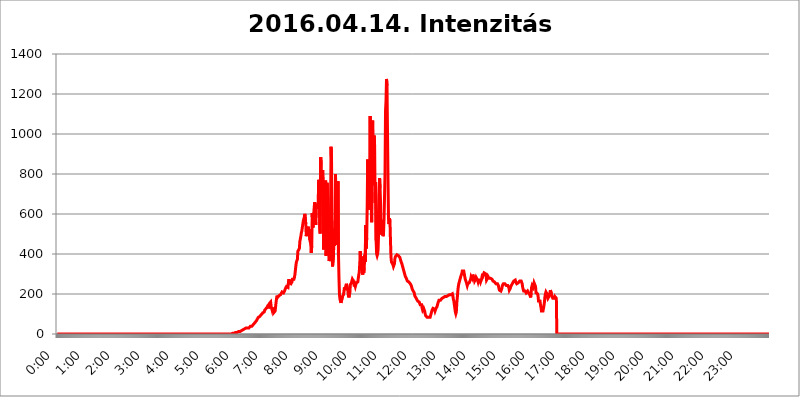
| Category | 2016.04.14. Intenzitás [W/m^2] |
|---|---|
| 0.0 | 0 |
| 0.0006944444444444445 | 0 |
| 0.001388888888888889 | 0 |
| 0.0020833333333333333 | 0 |
| 0.002777777777777778 | 0 |
| 0.003472222222222222 | 0 |
| 0.004166666666666667 | 0 |
| 0.004861111111111111 | 0 |
| 0.005555555555555556 | 0 |
| 0.0062499999999999995 | 0 |
| 0.006944444444444444 | 0 |
| 0.007638888888888889 | 0 |
| 0.008333333333333333 | 0 |
| 0.009027777777777779 | 0 |
| 0.009722222222222222 | 0 |
| 0.010416666666666666 | 0 |
| 0.011111111111111112 | 0 |
| 0.011805555555555555 | 0 |
| 0.012499999999999999 | 0 |
| 0.013194444444444444 | 0 |
| 0.013888888888888888 | 0 |
| 0.014583333333333332 | 0 |
| 0.015277777777777777 | 0 |
| 0.015972222222222224 | 0 |
| 0.016666666666666666 | 0 |
| 0.017361111111111112 | 0 |
| 0.018055555555555557 | 0 |
| 0.01875 | 0 |
| 0.019444444444444445 | 0 |
| 0.02013888888888889 | 0 |
| 0.020833333333333332 | 0 |
| 0.02152777777777778 | 0 |
| 0.022222222222222223 | 0 |
| 0.02291666666666667 | 0 |
| 0.02361111111111111 | 0 |
| 0.024305555555555556 | 0 |
| 0.024999999999999998 | 0 |
| 0.025694444444444447 | 0 |
| 0.02638888888888889 | 0 |
| 0.027083333333333334 | 0 |
| 0.027777777777777776 | 0 |
| 0.02847222222222222 | 0 |
| 0.029166666666666664 | 0 |
| 0.029861111111111113 | 0 |
| 0.030555555555555555 | 0 |
| 0.03125 | 0 |
| 0.03194444444444445 | 0 |
| 0.03263888888888889 | 0 |
| 0.03333333333333333 | 0 |
| 0.034027777777777775 | 0 |
| 0.034722222222222224 | 0 |
| 0.035416666666666666 | 0 |
| 0.036111111111111115 | 0 |
| 0.03680555555555556 | 0 |
| 0.0375 | 0 |
| 0.03819444444444444 | 0 |
| 0.03888888888888889 | 0 |
| 0.03958333333333333 | 0 |
| 0.04027777777777778 | 0 |
| 0.04097222222222222 | 0 |
| 0.041666666666666664 | 0 |
| 0.042361111111111106 | 0 |
| 0.04305555555555556 | 0 |
| 0.043750000000000004 | 0 |
| 0.044444444444444446 | 0 |
| 0.04513888888888889 | 0 |
| 0.04583333333333334 | 0 |
| 0.04652777777777778 | 0 |
| 0.04722222222222222 | 0 |
| 0.04791666666666666 | 0 |
| 0.04861111111111111 | 0 |
| 0.049305555555555554 | 0 |
| 0.049999999999999996 | 0 |
| 0.05069444444444445 | 0 |
| 0.051388888888888894 | 0 |
| 0.052083333333333336 | 0 |
| 0.05277777777777778 | 0 |
| 0.05347222222222222 | 0 |
| 0.05416666666666667 | 0 |
| 0.05486111111111111 | 0 |
| 0.05555555555555555 | 0 |
| 0.05625 | 0 |
| 0.05694444444444444 | 0 |
| 0.057638888888888885 | 0 |
| 0.05833333333333333 | 0 |
| 0.05902777777777778 | 0 |
| 0.059722222222222225 | 0 |
| 0.06041666666666667 | 0 |
| 0.061111111111111116 | 0 |
| 0.06180555555555556 | 0 |
| 0.0625 | 0 |
| 0.06319444444444444 | 0 |
| 0.06388888888888888 | 0 |
| 0.06458333333333334 | 0 |
| 0.06527777777777778 | 0 |
| 0.06597222222222222 | 0 |
| 0.06666666666666667 | 0 |
| 0.06736111111111111 | 0 |
| 0.06805555555555555 | 0 |
| 0.06874999999999999 | 0 |
| 0.06944444444444443 | 0 |
| 0.07013888888888889 | 0 |
| 0.07083333333333333 | 0 |
| 0.07152777777777779 | 0 |
| 0.07222222222222223 | 0 |
| 0.07291666666666667 | 0 |
| 0.07361111111111111 | 0 |
| 0.07430555555555556 | 0 |
| 0.075 | 0 |
| 0.07569444444444444 | 0 |
| 0.0763888888888889 | 0 |
| 0.07708333333333334 | 0 |
| 0.07777777777777778 | 0 |
| 0.07847222222222222 | 0 |
| 0.07916666666666666 | 0 |
| 0.0798611111111111 | 0 |
| 0.08055555555555556 | 0 |
| 0.08125 | 0 |
| 0.08194444444444444 | 0 |
| 0.08263888888888889 | 0 |
| 0.08333333333333333 | 0 |
| 0.08402777777777777 | 0 |
| 0.08472222222222221 | 0 |
| 0.08541666666666665 | 0 |
| 0.08611111111111112 | 0 |
| 0.08680555555555557 | 0 |
| 0.08750000000000001 | 0 |
| 0.08819444444444445 | 0 |
| 0.08888888888888889 | 0 |
| 0.08958333333333333 | 0 |
| 0.09027777777777778 | 0 |
| 0.09097222222222222 | 0 |
| 0.09166666666666667 | 0 |
| 0.09236111111111112 | 0 |
| 0.09305555555555556 | 0 |
| 0.09375 | 0 |
| 0.09444444444444444 | 0 |
| 0.09513888888888888 | 0 |
| 0.09583333333333333 | 0 |
| 0.09652777777777777 | 0 |
| 0.09722222222222222 | 0 |
| 0.09791666666666667 | 0 |
| 0.09861111111111111 | 0 |
| 0.09930555555555555 | 0 |
| 0.09999999999999999 | 0 |
| 0.10069444444444443 | 0 |
| 0.1013888888888889 | 0 |
| 0.10208333333333335 | 0 |
| 0.10277777777777779 | 0 |
| 0.10347222222222223 | 0 |
| 0.10416666666666667 | 0 |
| 0.10486111111111111 | 0 |
| 0.10555555555555556 | 0 |
| 0.10625 | 0 |
| 0.10694444444444444 | 0 |
| 0.1076388888888889 | 0 |
| 0.10833333333333334 | 0 |
| 0.10902777777777778 | 0 |
| 0.10972222222222222 | 0 |
| 0.1111111111111111 | 0 |
| 0.11180555555555556 | 0 |
| 0.11180555555555556 | 0 |
| 0.1125 | 0 |
| 0.11319444444444444 | 0 |
| 0.11388888888888889 | 0 |
| 0.11458333333333333 | 0 |
| 0.11527777777777777 | 0 |
| 0.11597222222222221 | 0 |
| 0.11666666666666665 | 0 |
| 0.1173611111111111 | 0 |
| 0.11805555555555557 | 0 |
| 0.11944444444444445 | 0 |
| 0.12013888888888889 | 0 |
| 0.12083333333333333 | 0 |
| 0.12152777777777778 | 0 |
| 0.12222222222222223 | 0 |
| 0.12291666666666667 | 0 |
| 0.12291666666666667 | 0 |
| 0.12361111111111112 | 0 |
| 0.12430555555555556 | 0 |
| 0.125 | 0 |
| 0.12569444444444444 | 0 |
| 0.12638888888888888 | 0 |
| 0.12708333333333333 | 0 |
| 0.16875 | 0 |
| 0.12847222222222224 | 0 |
| 0.12916666666666668 | 0 |
| 0.12986111111111112 | 0 |
| 0.13055555555555556 | 0 |
| 0.13125 | 0 |
| 0.13194444444444445 | 0 |
| 0.1326388888888889 | 0 |
| 0.13333333333333333 | 0 |
| 0.13402777777777777 | 0 |
| 0.13402777777777777 | 0 |
| 0.13472222222222222 | 0 |
| 0.13541666666666666 | 0 |
| 0.1361111111111111 | 0 |
| 0.13749999999999998 | 0 |
| 0.13819444444444443 | 0 |
| 0.1388888888888889 | 0 |
| 0.13958333333333334 | 0 |
| 0.14027777777777778 | 0 |
| 0.14097222222222222 | 0 |
| 0.14166666666666666 | 0 |
| 0.1423611111111111 | 0 |
| 0.14305555555555557 | 0 |
| 0.14375000000000002 | 0 |
| 0.14444444444444446 | 0 |
| 0.1451388888888889 | 0 |
| 0.1451388888888889 | 0 |
| 0.14652777777777778 | 0 |
| 0.14722222222222223 | 0 |
| 0.14791666666666667 | 0 |
| 0.1486111111111111 | 0 |
| 0.14930555555555555 | 0 |
| 0.15 | 0 |
| 0.15069444444444444 | 0 |
| 0.15138888888888888 | 0 |
| 0.15208333333333332 | 0 |
| 0.15277777777777776 | 0 |
| 0.15347222222222223 | 0 |
| 0.15416666666666667 | 0 |
| 0.15486111111111112 | 0 |
| 0.15555555555555556 | 0 |
| 0.15625 | 0 |
| 0.15694444444444444 | 0 |
| 0.15763888888888888 | 0 |
| 0.15833333333333333 | 0 |
| 0.15902777777777777 | 0 |
| 0.15972222222222224 | 0 |
| 0.16041666666666668 | 0 |
| 0.16111111111111112 | 0 |
| 0.16180555555555556 | 0 |
| 0.1625 | 0 |
| 0.16319444444444445 | 0 |
| 0.1638888888888889 | 0 |
| 0.16458333333333333 | 0 |
| 0.16527777777777777 | 0 |
| 0.16597222222222222 | 0 |
| 0.16666666666666666 | 0 |
| 0.1673611111111111 | 0 |
| 0.16805555555555554 | 0 |
| 0.16874999999999998 | 0 |
| 0.16944444444444443 | 0 |
| 0.17013888888888887 | 0 |
| 0.1708333333333333 | 0 |
| 0.17152777777777775 | 0 |
| 0.17222222222222225 | 0 |
| 0.1729166666666667 | 0 |
| 0.17361111111111113 | 0 |
| 0.17430555555555557 | 0 |
| 0.17500000000000002 | 0 |
| 0.17569444444444446 | 0 |
| 0.1763888888888889 | 0 |
| 0.17708333333333334 | 0 |
| 0.17777777777777778 | 0 |
| 0.17847222222222223 | 0 |
| 0.17916666666666667 | 0 |
| 0.1798611111111111 | 0 |
| 0.18055555555555555 | 0 |
| 0.18125 | 0 |
| 0.18194444444444444 | 0 |
| 0.1826388888888889 | 0 |
| 0.18333333333333335 | 0 |
| 0.1840277777777778 | 0 |
| 0.18472222222222223 | 0 |
| 0.18541666666666667 | 0 |
| 0.18611111111111112 | 0 |
| 0.18680555555555556 | 0 |
| 0.1875 | 0 |
| 0.18819444444444444 | 0 |
| 0.18888888888888888 | 0 |
| 0.18958333333333333 | 0 |
| 0.19027777777777777 | 0 |
| 0.1909722222222222 | 0 |
| 0.19166666666666665 | 0 |
| 0.19236111111111112 | 0 |
| 0.19305555555555554 | 0 |
| 0.19375 | 0 |
| 0.19444444444444445 | 0 |
| 0.1951388888888889 | 0 |
| 0.19583333333333333 | 0 |
| 0.19652777777777777 | 0 |
| 0.19722222222222222 | 0 |
| 0.19791666666666666 | 0 |
| 0.1986111111111111 | 0 |
| 0.19930555555555554 | 0 |
| 0.19999999999999998 | 0 |
| 0.20069444444444443 | 0 |
| 0.20138888888888887 | 0 |
| 0.2020833333333333 | 0 |
| 0.2027777777777778 | 0 |
| 0.2034722222222222 | 0 |
| 0.2041666666666667 | 0 |
| 0.20486111111111113 | 0 |
| 0.20555555555555557 | 0 |
| 0.20625000000000002 | 0 |
| 0.20694444444444446 | 0 |
| 0.2076388888888889 | 0 |
| 0.20833333333333334 | 0 |
| 0.20902777777777778 | 0 |
| 0.20972222222222223 | 0 |
| 0.21041666666666667 | 0 |
| 0.2111111111111111 | 0 |
| 0.21180555555555555 | 0 |
| 0.2125 | 0 |
| 0.21319444444444444 | 0 |
| 0.2138888888888889 | 0 |
| 0.21458333333333335 | 0 |
| 0.2152777777777778 | 0 |
| 0.21597222222222223 | 0 |
| 0.21666666666666667 | 0 |
| 0.21736111111111112 | 0 |
| 0.21805555555555556 | 0 |
| 0.21875 | 0 |
| 0.21944444444444444 | 0 |
| 0.22013888888888888 | 0 |
| 0.22083333333333333 | 0 |
| 0.22152777777777777 | 0 |
| 0.2222222222222222 | 0 |
| 0.22291666666666665 | 0 |
| 0.2236111111111111 | 0 |
| 0.22430555555555556 | 0 |
| 0.225 | 0 |
| 0.22569444444444445 | 0 |
| 0.2263888888888889 | 0 |
| 0.22708333333333333 | 0 |
| 0.22777777777777777 | 0 |
| 0.22847222222222222 | 0 |
| 0.22916666666666666 | 0 |
| 0.2298611111111111 | 0 |
| 0.23055555555555554 | 0 |
| 0.23124999999999998 | 0 |
| 0.23194444444444443 | 0 |
| 0.23263888888888887 | 0 |
| 0.2333333333333333 | 0 |
| 0.2340277777777778 | 0 |
| 0.2347222222222222 | 0 |
| 0.2354166666666667 | 0 |
| 0.23611111111111113 | 0 |
| 0.23680555555555557 | 0 |
| 0.23750000000000002 | 0 |
| 0.23819444444444446 | 0 |
| 0.2388888888888889 | 0 |
| 0.23958333333333334 | 0 |
| 0.24027777777777778 | 0 |
| 0.24097222222222223 | 0 |
| 0.24166666666666667 | 0 |
| 0.2423611111111111 | 0 |
| 0.24305555555555555 | 0 |
| 0.24375 | 0 |
| 0.24444444444444446 | 0 |
| 0.24513888888888888 | 0 |
| 0.24583333333333335 | 3.525 |
| 0.2465277777777778 | 3.525 |
| 0.24722222222222223 | 3.525 |
| 0.24791666666666667 | 3.525 |
| 0.24861111111111112 | 3.525 |
| 0.24930555555555556 | 3.525 |
| 0.25 | 7.887 |
| 0.25069444444444444 | 7.887 |
| 0.2513888888888889 | 7.887 |
| 0.2520833333333333 | 7.887 |
| 0.25277777777777777 | 12.257 |
| 0.2534722222222222 | 12.257 |
| 0.25416666666666665 | 12.257 |
| 0.2548611111111111 | 12.257 |
| 0.2555555555555556 | 12.257 |
| 0.25625000000000003 | 12.257 |
| 0.2569444444444445 | 16.636 |
| 0.2576388888888889 | 16.636 |
| 0.25833333333333336 | 16.636 |
| 0.2590277777777778 | 16.636 |
| 0.25972222222222224 | 21.024 |
| 0.2604166666666667 | 21.024 |
| 0.2611111111111111 | 21.024 |
| 0.26180555555555557 | 25.419 |
| 0.2625 | 25.419 |
| 0.26319444444444445 | 29.823 |
| 0.2638888888888889 | 29.823 |
| 0.26458333333333334 | 29.823 |
| 0.2652777777777778 | 29.823 |
| 0.2659722222222222 | 29.823 |
| 0.26666666666666666 | 29.823 |
| 0.2673611111111111 | 29.823 |
| 0.26805555555555555 | 29.823 |
| 0.26875 | 29.823 |
| 0.26944444444444443 | 34.234 |
| 0.2701388888888889 | 34.234 |
| 0.2708333333333333 | 38.653 |
| 0.27152777777777776 | 38.653 |
| 0.2722222222222222 | 38.653 |
| 0.27291666666666664 | 38.653 |
| 0.2736111111111111 | 43.079 |
| 0.2743055555555555 | 43.079 |
| 0.27499999999999997 | 47.511 |
| 0.27569444444444446 | 47.511 |
| 0.27638888888888885 | 51.951 |
| 0.27708333333333335 | 56.398 |
| 0.2777777777777778 | 60.85 |
| 0.27847222222222223 | 60.85 |
| 0.2791666666666667 | 65.31 |
| 0.2798611111111111 | 65.31 |
| 0.28055555555555556 | 74.246 |
| 0.28125 | 74.246 |
| 0.28194444444444444 | 83.205 |
| 0.2826388888888889 | 83.205 |
| 0.2833333333333333 | 83.205 |
| 0.28402777777777777 | 87.692 |
| 0.2847222222222222 | 87.692 |
| 0.28541666666666665 | 92.184 |
| 0.28611111111111115 | 96.682 |
| 0.28680555555555554 | 96.682 |
| 0.28750000000000003 | 101.184 |
| 0.2881944444444445 | 105.69 |
| 0.2888888888888889 | 105.69 |
| 0.28958333333333336 | 110.201 |
| 0.2902777777777778 | 110.201 |
| 0.29097222222222224 | 119.235 |
| 0.2916666666666667 | 119.235 |
| 0.2923611111111111 | 119.235 |
| 0.29305555555555557 | 128.284 |
| 0.29375 | 132.814 |
| 0.29444444444444445 | 123.758 |
| 0.2951388888888889 | 137.347 |
| 0.29583333333333334 | 146.423 |
| 0.2965277777777778 | 128.284 |
| 0.2972222222222222 | 150.964 |
| 0.29791666666666666 | 155.509 |
| 0.2986111111111111 | 155.509 |
| 0.29930555555555555 | 160.056 |
| 0.3 | 137.347 |
| 0.30069444444444443 | 132.814 |
| 0.3013888888888889 | 119.235 |
| 0.3020833333333333 | 114.716 |
| 0.30277777777777776 | 132.814 |
| 0.3034722222222222 | 105.69 |
| 0.30416666666666664 | 110.201 |
| 0.3048611111111111 | 110.201 |
| 0.3055555555555555 | 114.716 |
| 0.30624999999999997 | 119.235 |
| 0.3069444444444444 | 160.056 |
| 0.3076388888888889 | 178.264 |
| 0.30833333333333335 | 191.937 |
| 0.3090277777777778 | 182.82 |
| 0.30972222222222223 | 187.378 |
| 0.3104166666666667 | 187.378 |
| 0.3111111111111111 | 191.937 |
| 0.31180555555555556 | 196.497 |
| 0.3125 | 191.937 |
| 0.31319444444444444 | 196.497 |
| 0.3138888888888889 | 196.497 |
| 0.3145833333333333 | 201.058 |
| 0.31527777777777777 | 210.182 |
| 0.3159722222222222 | 205.62 |
| 0.31666666666666665 | 205.62 |
| 0.31736111111111115 | 205.62 |
| 0.31805555555555554 | 210.182 |
| 0.31875000000000003 | 214.746 |
| 0.3194444444444445 | 219.309 |
| 0.3201388888888889 | 228.436 |
| 0.32083333333333336 | 228.436 |
| 0.3215277777777778 | 237.564 |
| 0.32222222222222224 | 233 |
| 0.3229166666666667 | 237.564 |
| 0.3236111111111111 | 233 |
| 0.32430555555555557 | 260.373 |
| 0.325 | 274.047 |
| 0.32569444444444445 | 255.813 |
| 0.3263888888888889 | 260.373 |
| 0.32708333333333334 | 251.251 |
| 0.3277777777777778 | 251.251 |
| 0.3284722222222222 | 255.813 |
| 0.32916666666666666 | 260.373 |
| 0.3298611111111111 | 274.047 |
| 0.33055555555555555 | 269.49 |
| 0.33125 | 269.49 |
| 0.33194444444444443 | 274.047 |
| 0.3326388888888889 | 283.156 |
| 0.3333333333333333 | 296.808 |
| 0.3340277777777778 | 319.517 |
| 0.3347222222222222 | 342.162 |
| 0.3354166666666667 | 360.221 |
| 0.3361111111111111 | 360.221 |
| 0.3368055555555556 | 373.729 |
| 0.33749999999999997 | 414.035 |
| 0.33819444444444446 | 409.574 |
| 0.33888888888888885 | 414.035 |
| 0.33958333333333335 | 427.39 |
| 0.34027777777777773 | 462.786 |
| 0.34097222222222223 | 475.972 |
| 0.3416666666666666 | 489.108 |
| 0.3423611111111111 | 506.542 |
| 0.3430555555555555 | 515.223 |
| 0.34375 | 532.513 |
| 0.3444444444444445 | 549.704 |
| 0.3451388888888889 | 566.793 |
| 0.3458333333333334 | 575.299 |
| 0.34652777777777777 | 583.779 |
| 0.34722222222222227 | 600.661 |
| 0.34791666666666665 | 596.45 |
| 0.34861111111111115 | 549.704 |
| 0.34930555555555554 | 489.108 |
| 0.35000000000000003 | 515.223 |
| 0.3506944444444444 | 519.555 |
| 0.3513888888888889 | 515.223 |
| 0.3520833333333333 | 536.82 |
| 0.3527777777777778 | 493.475 |
| 0.3534722222222222 | 523.88 |
| 0.3541666666666667 | 471.582 |
| 0.3548611111111111 | 475.972 |
| 0.35555555555555557 | 449.551 |
| 0.35625 | 405.108 |
| 0.35694444444444445 | 440.702 |
| 0.3576388888888889 | 604.864 |
| 0.35833333333333334 | 532.513 |
| 0.3590277777777778 | 541.121 |
| 0.3597222222222222 | 600.661 |
| 0.36041666666666666 | 634.105 |
| 0.3611111111111111 | 658.909 |
| 0.36180555555555555 | 638.256 |
| 0.3625 | 545.416 |
| 0.36319444444444443 | 650.667 |
| 0.3638888888888889 | 642.4 |
| 0.3645833333333333 | 625.784 |
| 0.3652777777777778 | 625.784 |
| 0.3659722222222222 | 650.667 |
| 0.3666666666666667 | 771.559 |
| 0.3673611111111111 | 755.766 |
| 0.3680555555555556 | 532.513 |
| 0.36874999999999997 | 502.192 |
| 0.36944444444444446 | 883.516 |
| 0.37013888888888885 | 849.199 |
| 0.37083333333333335 | 759.723 |
| 0.37152777777777773 | 747.834 |
| 0.37222222222222223 | 818.392 |
| 0.3729166666666666 | 747.834 |
| 0.3736111111111111 | 422.943 |
| 0.3743055555555555 | 699.717 |
| 0.375 | 523.88 |
| 0.3756944444444445 | 541.121 |
| 0.3763888888888889 | 767.62 |
| 0.3770833333333334 | 391.685 |
| 0.37777777777777777 | 431.833 |
| 0.37847222222222227 | 755.766 |
| 0.37916666666666665 | 699.717 |
| 0.37986111111111115 | 650.667 |
| 0.38055555555555554 | 431.833 |
| 0.38125000000000003 | 364.728 |
| 0.3819444444444444 | 373.729 |
| 0.3826388888888889 | 497.836 |
| 0.3833333333333333 | 634.105 |
| 0.3840277777777778 | 936.33 |
| 0.3847222222222222 | 860.676 |
| 0.3854166666666667 | 462.786 |
| 0.3861111111111111 | 337.639 |
| 0.38680555555555557 | 333.113 |
| 0.3875 | 396.164 |
| 0.38819444444444445 | 523.88 |
| 0.3888888888888889 | 440.702 |
| 0.38958333333333334 | 566.793 |
| 0.3902777777777778 | 798.974 |
| 0.3909722222222222 | 449.551 |
| 0.39166666666666666 | 471.582 |
| 0.3923611111111111 | 445.129 |
| 0.39305555555555555 | 458.38 |
| 0.39375 | 763.674 |
| 0.39444444444444443 | 396.164 |
| 0.3951388888888889 | 278.603 |
| 0.3958333333333333 | 196.497 |
| 0.3965277777777778 | 173.709 |
| 0.3972222222222222 | 173.709 |
| 0.3979166666666667 | 155.509 |
| 0.3986111111111111 | 155.509 |
| 0.3993055555555556 | 155.509 |
| 0.39999999999999997 | 187.378 |
| 0.40069444444444446 | 187.378 |
| 0.40138888888888885 | 196.497 |
| 0.40208333333333335 | 210.182 |
| 0.40277777777777773 | 233 |
| 0.40347222222222223 | 219.309 |
| 0.4041666666666666 | 233 |
| 0.4048611111111111 | 242.127 |
| 0.4055555555555555 | 251.251 |
| 0.40625 | 251.251 |
| 0.4069444444444445 | 228.436 |
| 0.4076388888888889 | 214.746 |
| 0.4083333333333334 | 191.937 |
| 0.40902777777777777 | 182.82 |
| 0.40972222222222227 | 187.378 |
| 0.41041666666666665 | 210.182 |
| 0.41111111111111115 | 246.689 |
| 0.41180555555555554 | 242.127 |
| 0.41250000000000003 | 255.813 |
| 0.4131944444444444 | 251.251 |
| 0.4138888888888889 | 274.047 |
| 0.4145833333333333 | 269.49 |
| 0.4152777777777778 | 264.932 |
| 0.4159722222222222 | 251.251 |
| 0.4166666666666667 | 237.564 |
| 0.4173611111111111 | 246.689 |
| 0.41805555555555557 | 237.564 |
| 0.41875 | 237.564 |
| 0.41944444444444445 | 255.813 |
| 0.4201388888888889 | 260.373 |
| 0.42083333333333334 | 260.373 |
| 0.4215277777777778 | 260.373 |
| 0.4222222222222222 | 255.813 |
| 0.42291666666666666 | 296.808 |
| 0.4236111111111111 | 310.44 |
| 0.42430555555555555 | 351.198 |
| 0.425 | 414.035 |
| 0.42569444444444443 | 333.113 |
| 0.4263888888888889 | 342.162 |
| 0.4270833333333333 | 387.202 |
| 0.4277777777777778 | 305.898 |
| 0.4284722222222222 | 296.808 |
| 0.4291666666666667 | 319.517 |
| 0.4298611111111111 | 305.898 |
| 0.4305555555555556 | 328.584 |
| 0.43124999999999997 | 396.164 |
| 0.43194444444444446 | 360.221 |
| 0.43263888888888885 | 545.416 |
| 0.43333333333333335 | 427.39 |
| 0.43402777777777773 | 480.356 |
| 0.43472222222222223 | 642.4 |
| 0.4354166666666666 | 872.114 |
| 0.4361111111111111 | 621.613 |
| 0.4368055555555555 | 687.544 |
| 0.4375 | 723.889 |
| 0.4381944444444445 | 787.258 |
| 0.4388888888888889 | 1089.873 |
| 0.4395833333333334 | 723.889 |
| 0.44027777777777777 | 703.762 |
| 0.44097222222222227 | 558.261 |
| 0.44166666666666665 | 1022.323 |
| 0.44236111111111115 | 1067.267 |
| 0.44305555555555554 | 743.859 |
| 0.44375000000000003 | 917.534 |
| 0.4444444444444444 | 992.448 |
| 0.4451388888888889 | 940.082 |
| 0.4458333333333333 | 654.791 |
| 0.4465277777777778 | 759.723 |
| 0.4472222222222222 | 467.187 |
| 0.4479166666666667 | 400.638 |
| 0.4486111111111111 | 391.685 |
| 0.44930555555555557 | 400.638 |
| 0.45 | 422.943 |
| 0.45069444444444445 | 502.192 |
| 0.4513888888888889 | 691.608 |
| 0.45208333333333334 | 779.42 |
| 0.4527777777777778 | 727.896 |
| 0.4534722222222222 | 654.791 |
| 0.45416666666666666 | 497.836 |
| 0.4548611111111111 | 549.704 |
| 0.45555555555555555 | 571.049 |
| 0.45625 | 545.416 |
| 0.45694444444444443 | 489.108 |
| 0.4576388888888889 | 506.542 |
| 0.4583333333333333 | 575.299 |
| 0.4590277777777778 | 687.544 |
| 0.4597222222222222 | 802.868 |
| 0.4604166666666667 | 1116.426 |
| 0.4611111111111111 | 1166.46 |
| 0.4618055555555556 | 1275.142 |
| 0.46249999999999997 | 1242.089 |
| 0.46319444444444446 | 1242.089 |
| 0.46388888888888885 | 775.492 |
| 0.46458333333333335 | 579.542 |
| 0.46527777777777773 | 549.704 |
| 0.46597222222222223 | 579.542 |
| 0.4666666666666666 | 562.53 |
| 0.4673611111111111 | 467.187 |
| 0.4680555555555555 | 387.202 |
| 0.46875 | 360.221 |
| 0.4694444444444445 | 360.221 |
| 0.4701388888888889 | 355.712 |
| 0.4708333333333334 | 346.682 |
| 0.47152777777777777 | 337.639 |
| 0.47222222222222227 | 337.639 |
| 0.47291666666666665 | 351.198 |
| 0.47361111111111115 | 378.224 |
| 0.47430555555555554 | 387.202 |
| 0.47500000000000003 | 391.685 |
| 0.4756944444444444 | 391.685 |
| 0.4763888888888889 | 396.164 |
| 0.4770833333333333 | 396.164 |
| 0.4777777777777778 | 396.164 |
| 0.4784722222222222 | 391.685 |
| 0.4791666666666667 | 387.202 |
| 0.4798611111111111 | 387.202 |
| 0.48055555555555557 | 382.715 |
| 0.48125 | 373.729 |
| 0.48194444444444445 | 364.728 |
| 0.4826388888888889 | 360.221 |
| 0.48333333333333334 | 351.198 |
| 0.4840277777777778 | 342.162 |
| 0.4847222222222222 | 333.113 |
| 0.48541666666666666 | 324.052 |
| 0.4861111111111111 | 314.98 |
| 0.48680555555555555 | 310.44 |
| 0.4875 | 296.808 |
| 0.48819444444444443 | 287.709 |
| 0.4888888888888889 | 287.709 |
| 0.4895833333333333 | 278.603 |
| 0.4902777777777778 | 274.047 |
| 0.4909722222222222 | 264.932 |
| 0.4916666666666667 | 260.373 |
| 0.4923611111111111 | 260.373 |
| 0.4930555555555556 | 260.373 |
| 0.49374999999999997 | 260.373 |
| 0.49444444444444446 | 255.813 |
| 0.49513888888888885 | 251.251 |
| 0.49583333333333335 | 251.251 |
| 0.49652777777777773 | 242.127 |
| 0.49722222222222223 | 233 |
| 0.4979166666666666 | 223.873 |
| 0.4986111111111111 | 219.309 |
| 0.4993055555555555 | 214.746 |
| 0.5 | 210.182 |
| 0.5006944444444444 | 205.62 |
| 0.5013888888888889 | 191.937 |
| 0.5020833333333333 | 187.378 |
| 0.5027777777777778 | 182.82 |
| 0.5034722222222222 | 178.264 |
| 0.5041666666666667 | 173.709 |
| 0.5048611111111111 | 169.156 |
| 0.5055555555555555 | 164.605 |
| 0.50625 | 164.605 |
| 0.5069444444444444 | 164.605 |
| 0.5076388888888889 | 160.056 |
| 0.5083333333333333 | 155.509 |
| 0.5090277777777777 | 146.423 |
| 0.5097222222222222 | 141.884 |
| 0.5104166666666666 | 141.884 |
| 0.5111111111111112 | 146.423 |
| 0.5118055555555555 | 128.284 |
| 0.5125000000000001 | 119.235 |
| 0.5131944444444444 | 119.235 |
| 0.513888888888889 | 128.284 |
| 0.5145833333333333 | 123.758 |
| 0.5152777777777778 | 114.716 |
| 0.5159722222222222 | 101.184 |
| 0.5166666666666667 | 92.184 |
| 0.517361111111111 | 87.692 |
| 0.5180555555555556 | 87.692 |
| 0.5187499999999999 | 83.205 |
| 0.5194444444444445 | 83.205 |
| 0.5201388888888888 | 83.205 |
| 0.5208333333333334 | 83.205 |
| 0.5215277777777778 | 83.205 |
| 0.5222222222222223 | 83.205 |
| 0.5229166666666667 | 83.205 |
| 0.5236111111111111 | 87.692 |
| 0.5243055555555556 | 101.184 |
| 0.525 | 110.201 |
| 0.5256944444444445 | 119.235 |
| 0.5263888888888889 | 119.235 |
| 0.5270833333333333 | 128.284 |
| 0.5277777777777778 | 128.284 |
| 0.5284722222222222 | 128.284 |
| 0.5291666666666667 | 123.758 |
| 0.5298611111111111 | 114.716 |
| 0.5305555555555556 | 119.235 |
| 0.53125 | 128.284 |
| 0.5319444444444444 | 132.814 |
| 0.5326388888888889 | 137.347 |
| 0.5333333333333333 | 146.423 |
| 0.5340277777777778 | 155.509 |
| 0.5347222222222222 | 160.056 |
| 0.5354166666666667 | 169.156 |
| 0.5361111111111111 | 173.709 |
| 0.5368055555555555 | 173.709 |
| 0.5375 | 169.156 |
| 0.5381944444444444 | 164.605 |
| 0.5388888888888889 | 169.156 |
| 0.5395833333333333 | 178.264 |
| 0.5402777777777777 | 182.82 |
| 0.5409722222222222 | 182.82 |
| 0.5416666666666666 | 182.82 |
| 0.5423611111111112 | 182.82 |
| 0.5430555555555555 | 187.378 |
| 0.5437500000000001 | 187.378 |
| 0.5444444444444444 | 187.378 |
| 0.545138888888889 | 187.378 |
| 0.5458333333333333 | 187.378 |
| 0.5465277777777778 | 187.378 |
| 0.5472222222222222 | 187.378 |
| 0.5479166666666667 | 191.937 |
| 0.548611111111111 | 191.937 |
| 0.5493055555555556 | 191.937 |
| 0.5499999999999999 | 196.497 |
| 0.5506944444444445 | 191.937 |
| 0.5513888888888888 | 191.937 |
| 0.5520833333333334 | 196.497 |
| 0.5527777777777778 | 196.497 |
| 0.5534722222222223 | 196.497 |
| 0.5541666666666667 | 201.058 |
| 0.5548611111111111 | 191.937 |
| 0.5555555555555556 | 173.709 |
| 0.55625 | 164.605 |
| 0.5569444444444445 | 146.423 |
| 0.5576388888888889 | 128.284 |
| 0.5583333333333333 | 110.201 |
| 0.5590277777777778 | 101.184 |
| 0.5597222222222222 | 110.201 |
| 0.5604166666666667 | 155.509 |
| 0.5611111111111111 | 182.82 |
| 0.5618055555555556 | 214.746 |
| 0.5625 | 237.564 |
| 0.5631944444444444 | 251.251 |
| 0.5638888888888889 | 260.373 |
| 0.5645833333333333 | 269.49 |
| 0.5652777777777778 | 278.603 |
| 0.5659722222222222 | 287.709 |
| 0.5666666666666667 | 292.259 |
| 0.5673611111111111 | 301.354 |
| 0.5680555555555555 | 314.98 |
| 0.56875 | 319.517 |
| 0.5694444444444444 | 319.517 |
| 0.5701388888888889 | 314.98 |
| 0.5708333333333333 | 301.354 |
| 0.5715277777777777 | 287.709 |
| 0.5722222222222222 | 274.047 |
| 0.5729166666666666 | 269.49 |
| 0.5736111111111112 | 260.373 |
| 0.5743055555555555 | 255.813 |
| 0.5750000000000001 | 242.127 |
| 0.5756944444444444 | 251.251 |
| 0.576388888888889 | 251.251 |
| 0.5770833333333333 | 255.813 |
| 0.5777777777777778 | 255.813 |
| 0.5784722222222222 | 251.251 |
| 0.5791666666666667 | 260.373 |
| 0.579861111111111 | 274.047 |
| 0.5805555555555556 | 287.709 |
| 0.5812499999999999 | 287.709 |
| 0.5819444444444445 | 278.603 |
| 0.5826388888888888 | 296.808 |
| 0.5833333333333334 | 301.354 |
| 0.5840277777777778 | 292.259 |
| 0.5847222222222223 | 278.603 |
| 0.5854166666666667 | 264.932 |
| 0.5861111111111111 | 260.373 |
| 0.5868055555555556 | 274.047 |
| 0.5875 | 283.156 |
| 0.5881944444444445 | 278.603 |
| 0.5888888888888889 | 278.603 |
| 0.5895833333333333 | 269.49 |
| 0.5902777777777778 | 260.373 |
| 0.5909722222222222 | 269.49 |
| 0.5916666666666667 | 269.49 |
| 0.5923611111111111 | 264.932 |
| 0.5930555555555556 | 269.49 |
| 0.59375 | 260.373 |
| 0.5944444444444444 | 255.813 |
| 0.5951388888888889 | 274.047 |
| 0.5958333333333333 | 287.709 |
| 0.5965277777777778 | 301.354 |
| 0.5972222222222222 | 292.259 |
| 0.5979166666666667 | 296.808 |
| 0.5986111111111111 | 305.898 |
| 0.5993055555555555 | 305.898 |
| 0.6 | 305.898 |
| 0.6006944444444444 | 301.354 |
| 0.6013888888888889 | 292.259 |
| 0.6020833333333333 | 269.49 |
| 0.6027777777777777 | 264.932 |
| 0.6034722222222222 | 278.603 |
| 0.6041666666666666 | 287.709 |
| 0.6048611111111112 | 283.156 |
| 0.6055555555555555 | 278.603 |
| 0.6062500000000001 | 278.603 |
| 0.6069444444444444 | 278.603 |
| 0.607638888888889 | 278.603 |
| 0.6083333333333333 | 278.603 |
| 0.6090277777777778 | 278.603 |
| 0.6097222222222222 | 274.047 |
| 0.6104166666666667 | 269.49 |
| 0.611111111111111 | 264.932 |
| 0.6118055555555556 | 260.373 |
| 0.6124999999999999 | 260.373 |
| 0.6131944444444445 | 260.373 |
| 0.6138888888888888 | 260.373 |
| 0.6145833333333334 | 255.813 |
| 0.6152777777777778 | 251.251 |
| 0.6159722222222223 | 255.813 |
| 0.6166666666666667 | 251.251 |
| 0.6173611111111111 | 251.251 |
| 0.6180555555555556 | 246.689 |
| 0.61875 | 242.127 |
| 0.6194444444444445 | 228.436 |
| 0.6201388888888889 | 219.309 |
| 0.6208333333333333 | 219.309 |
| 0.6215277777777778 | 219.309 |
| 0.6222222222222222 | 214.746 |
| 0.6229166666666667 | 219.309 |
| 0.6236111111111111 | 228.436 |
| 0.6243055555555556 | 242.127 |
| 0.625 | 246.689 |
| 0.6256944444444444 | 251.251 |
| 0.6263888888888889 | 251.251 |
| 0.6270833333333333 | 251.251 |
| 0.6277777777777778 | 251.251 |
| 0.6284722222222222 | 251.251 |
| 0.6291666666666667 | 251.251 |
| 0.6298611111111111 | 242.127 |
| 0.6305555555555555 | 242.127 |
| 0.63125 | 242.127 |
| 0.6319444444444444 | 242.127 |
| 0.6326388888888889 | 242.127 |
| 0.6333333333333333 | 233 |
| 0.6340277777777777 | 219.309 |
| 0.6347222222222222 | 223.873 |
| 0.6354166666666666 | 228.436 |
| 0.6361111111111112 | 237.564 |
| 0.6368055555555555 | 242.127 |
| 0.6375000000000001 | 246.689 |
| 0.6381944444444444 | 251.251 |
| 0.638888888888889 | 255.813 |
| 0.6395833333333333 | 260.373 |
| 0.6402777777777778 | 264.932 |
| 0.6409722222222222 | 269.49 |
| 0.6416666666666667 | 269.49 |
| 0.642361111111111 | 269.49 |
| 0.6430555555555556 | 260.373 |
| 0.6437499999999999 | 255.813 |
| 0.6444444444444445 | 251.251 |
| 0.6451388888888888 | 251.251 |
| 0.6458333333333334 | 251.251 |
| 0.6465277777777778 | 255.813 |
| 0.6472222222222223 | 255.813 |
| 0.6479166666666667 | 260.373 |
| 0.6486111111111111 | 264.932 |
| 0.6493055555555556 | 269.49 |
| 0.65 | 269.49 |
| 0.6506944444444445 | 264.932 |
| 0.6513888888888889 | 260.373 |
| 0.6520833333333333 | 251.251 |
| 0.6527777777777778 | 233 |
| 0.6534722222222222 | 223.873 |
| 0.6541666666666667 | 214.746 |
| 0.6548611111111111 | 214.746 |
| 0.6555555555555556 | 214.746 |
| 0.65625 | 214.746 |
| 0.6569444444444444 | 210.182 |
| 0.6576388888888889 | 205.62 |
| 0.6583333333333333 | 205.62 |
| 0.6590277777777778 | 201.058 |
| 0.6597222222222222 | 214.746 |
| 0.6604166666666667 | 214.746 |
| 0.6611111111111111 | 219.309 |
| 0.6618055555555555 | 201.058 |
| 0.6625 | 196.497 |
| 0.6631944444444444 | 191.937 |
| 0.6638888888888889 | 182.82 |
| 0.6645833333333333 | 205.62 |
| 0.6652777777777777 | 233 |
| 0.6659722222222222 | 242.127 |
| 0.6666666666666666 | 242.127 |
| 0.6673611111111111 | 233 |
| 0.6680555555555556 | 242.127 |
| 0.6687500000000001 | 255.813 |
| 0.6694444444444444 | 260.373 |
| 0.6701388888888888 | 251.251 |
| 0.6708333333333334 | 237.564 |
| 0.6715277777777778 | 205.62 |
| 0.6722222222222222 | 205.62 |
| 0.6729166666666666 | 205.62 |
| 0.6736111111111112 | 201.058 |
| 0.6743055555555556 | 191.937 |
| 0.6749999999999999 | 164.605 |
| 0.6756944444444444 | 169.156 |
| 0.6763888888888889 | 164.605 |
| 0.6770833333333334 | 164.605 |
| 0.6777777777777777 | 146.423 |
| 0.6784722222222223 | 132.814 |
| 0.6791666666666667 | 114.716 |
| 0.6798611111111111 | 110.201 |
| 0.6805555555555555 | 110.201 |
| 0.68125 | 114.716 |
| 0.6819444444444445 | 119.235 |
| 0.6826388888888889 | 141.884 |
| 0.6833333333333332 | 160.056 |
| 0.6840277777777778 | 187.378 |
| 0.6847222222222222 | 201.058 |
| 0.6854166666666667 | 210.182 |
| 0.686111111111111 | 210.182 |
| 0.6868055555555556 | 201.058 |
| 0.6875 | 187.378 |
| 0.6881944444444444 | 178.264 |
| 0.688888888888889 | 178.264 |
| 0.6895833333333333 | 182.82 |
| 0.6902777777777778 | 191.937 |
| 0.6909722222222222 | 196.497 |
| 0.6916666666666668 | 219.309 |
| 0.6923611111111111 | 219.309 |
| 0.6930555555555555 | 201.058 |
| 0.69375 | 187.378 |
| 0.6944444444444445 | 182.82 |
| 0.6951388888888889 | 178.264 |
| 0.6958333333333333 | 173.709 |
| 0.6965277777777777 | 178.264 |
| 0.6972222222222223 | 178.264 |
| 0.6979166666666666 | 187.378 |
| 0.6986111111111111 | 187.378 |
| 0.6993055555555556 | 182.82 |
| 0.7000000000000001 | 178.264 |
| 0.7006944444444444 | 0 |
| 0.7013888888888888 | 0 |
| 0.7020833333333334 | 0 |
| 0.7027777777777778 | 0 |
| 0.7034722222222222 | 0 |
| 0.7041666666666666 | 0 |
| 0.7048611111111112 | 0 |
| 0.7055555555555556 | 0 |
| 0.7062499999999999 | 0 |
| 0.7069444444444444 | 0 |
| 0.7076388888888889 | 0 |
| 0.7083333333333334 | 0 |
| 0.7090277777777777 | 0 |
| 0.7097222222222223 | 0 |
| 0.7104166666666667 | 0 |
| 0.7111111111111111 | 0 |
| 0.7118055555555555 | 0 |
| 0.7125 | 0 |
| 0.7131944444444445 | 0 |
| 0.7138888888888889 | 0 |
| 0.7145833333333332 | 0 |
| 0.7152777777777778 | 0 |
| 0.7159722222222222 | 0 |
| 0.7166666666666667 | 0 |
| 0.717361111111111 | 0 |
| 0.7180555555555556 | 0 |
| 0.71875 | 0 |
| 0.7194444444444444 | 0 |
| 0.720138888888889 | 0 |
| 0.7208333333333333 | 0 |
| 0.7215277777777778 | 0 |
| 0.7222222222222222 | 0 |
| 0.7229166666666668 | 0 |
| 0.7236111111111111 | 0 |
| 0.7243055555555555 | 0 |
| 0.725 | 0 |
| 0.7256944444444445 | 0 |
| 0.7263888888888889 | 0 |
| 0.7270833333333333 | 0 |
| 0.7277777777777777 | 0 |
| 0.7284722222222223 | 0 |
| 0.7291666666666666 | 0 |
| 0.7298611111111111 | 0 |
| 0.7305555555555556 | 0 |
| 0.7312500000000001 | 0 |
| 0.7319444444444444 | 0 |
| 0.7326388888888888 | 0 |
| 0.7333333333333334 | 0 |
| 0.7340277777777778 | 0 |
| 0.7347222222222222 | 0 |
| 0.7354166666666666 | 0 |
| 0.7361111111111112 | 0 |
| 0.7368055555555556 | 0 |
| 0.7374999999999999 | 0 |
| 0.7381944444444444 | 0 |
| 0.7388888888888889 | 0 |
| 0.7395833333333334 | 0 |
| 0.7402777777777777 | 0 |
| 0.7409722222222223 | 0 |
| 0.7416666666666667 | 0 |
| 0.7423611111111111 | 0 |
| 0.7430555555555555 | 0 |
| 0.74375 | 0 |
| 0.7444444444444445 | 0 |
| 0.7451388888888889 | 0 |
| 0.7458333333333332 | 0 |
| 0.7465277777777778 | 0 |
| 0.7472222222222222 | 0 |
| 0.7479166666666667 | 0 |
| 0.748611111111111 | 0 |
| 0.7493055555555556 | 0 |
| 0.75 | 0 |
| 0.7506944444444444 | 0 |
| 0.751388888888889 | 0 |
| 0.7520833333333333 | 0 |
| 0.7527777777777778 | 0 |
| 0.7534722222222222 | 0 |
| 0.7541666666666668 | 0 |
| 0.7548611111111111 | 0 |
| 0.7555555555555555 | 0 |
| 0.75625 | 0 |
| 0.7569444444444445 | 0 |
| 0.7576388888888889 | 0 |
| 0.7583333333333333 | 0 |
| 0.7590277777777777 | 0 |
| 0.7597222222222223 | 0 |
| 0.7604166666666666 | 0 |
| 0.7611111111111111 | 0 |
| 0.7618055555555556 | 0 |
| 0.7625000000000001 | 0 |
| 0.7631944444444444 | 0 |
| 0.7638888888888888 | 0 |
| 0.7645833333333334 | 0 |
| 0.7652777777777778 | 0 |
| 0.7659722222222222 | 0 |
| 0.7666666666666666 | 0 |
| 0.7673611111111112 | 0 |
| 0.7680555555555556 | 0 |
| 0.7687499999999999 | 0 |
| 0.7694444444444444 | 0 |
| 0.7701388888888889 | 0 |
| 0.7708333333333334 | 0 |
| 0.7715277777777777 | 0 |
| 0.7722222222222223 | 0 |
| 0.7729166666666667 | 0 |
| 0.7736111111111111 | 0 |
| 0.7743055555555555 | 0 |
| 0.775 | 0 |
| 0.7756944444444445 | 0 |
| 0.7763888888888889 | 0 |
| 0.7770833333333332 | 0 |
| 0.7777777777777778 | 0 |
| 0.7784722222222222 | 0 |
| 0.7791666666666667 | 0 |
| 0.779861111111111 | 0 |
| 0.7805555555555556 | 0 |
| 0.78125 | 0 |
| 0.7819444444444444 | 0 |
| 0.782638888888889 | 0 |
| 0.7833333333333333 | 0 |
| 0.7840277777777778 | 0 |
| 0.7847222222222222 | 0 |
| 0.7854166666666668 | 0 |
| 0.7861111111111111 | 0 |
| 0.7868055555555555 | 0 |
| 0.7875 | 0 |
| 0.7881944444444445 | 0 |
| 0.7888888888888889 | 0 |
| 0.7895833333333333 | 0 |
| 0.7902777777777777 | 0 |
| 0.7909722222222223 | 0 |
| 0.7916666666666666 | 0 |
| 0.7923611111111111 | 0 |
| 0.7930555555555556 | 0 |
| 0.7937500000000001 | 0 |
| 0.7944444444444444 | 0 |
| 0.7951388888888888 | 0 |
| 0.7958333333333334 | 0 |
| 0.7965277777777778 | 0 |
| 0.7972222222222222 | 0 |
| 0.7979166666666666 | 0 |
| 0.7986111111111112 | 0 |
| 0.7993055555555556 | 0 |
| 0.7999999999999999 | 0 |
| 0.8006944444444444 | 0 |
| 0.8013888888888889 | 0 |
| 0.8020833333333334 | 0 |
| 0.8027777777777777 | 0 |
| 0.8034722222222223 | 0 |
| 0.8041666666666667 | 0 |
| 0.8048611111111111 | 0 |
| 0.8055555555555555 | 0 |
| 0.80625 | 0 |
| 0.8069444444444445 | 0 |
| 0.8076388888888889 | 0 |
| 0.8083333333333332 | 0 |
| 0.8090277777777778 | 0 |
| 0.8097222222222222 | 0 |
| 0.8104166666666667 | 0 |
| 0.811111111111111 | 0 |
| 0.8118055555555556 | 0 |
| 0.8125 | 0 |
| 0.8131944444444444 | 0 |
| 0.813888888888889 | 0 |
| 0.8145833333333333 | 0 |
| 0.8152777777777778 | 0 |
| 0.8159722222222222 | 0 |
| 0.8166666666666668 | 0 |
| 0.8173611111111111 | 0 |
| 0.8180555555555555 | 0 |
| 0.81875 | 0 |
| 0.8194444444444445 | 0 |
| 0.8201388888888889 | 0 |
| 0.8208333333333333 | 0 |
| 0.8215277777777777 | 0 |
| 0.8222222222222223 | 0 |
| 0.8229166666666666 | 0 |
| 0.8236111111111111 | 0 |
| 0.8243055555555556 | 0 |
| 0.8250000000000001 | 0 |
| 0.8256944444444444 | 0 |
| 0.8263888888888888 | 0 |
| 0.8270833333333334 | 0 |
| 0.8277777777777778 | 0 |
| 0.8284722222222222 | 0 |
| 0.8291666666666666 | 0 |
| 0.8298611111111112 | 0 |
| 0.8305555555555556 | 0 |
| 0.8312499999999999 | 0 |
| 0.8319444444444444 | 0 |
| 0.8326388888888889 | 0 |
| 0.8333333333333334 | 0 |
| 0.8340277777777777 | 0 |
| 0.8347222222222223 | 0 |
| 0.8354166666666667 | 0 |
| 0.8361111111111111 | 0 |
| 0.8368055555555555 | 0 |
| 0.8375 | 0 |
| 0.8381944444444445 | 0 |
| 0.8388888888888889 | 0 |
| 0.8395833333333332 | 0 |
| 0.8402777777777778 | 0 |
| 0.8409722222222222 | 0 |
| 0.8416666666666667 | 0 |
| 0.842361111111111 | 0 |
| 0.8430555555555556 | 0 |
| 0.84375 | 0 |
| 0.8444444444444444 | 0 |
| 0.845138888888889 | 0 |
| 0.8458333333333333 | 0 |
| 0.8465277777777778 | 0 |
| 0.8472222222222222 | 0 |
| 0.8479166666666668 | 0 |
| 0.8486111111111111 | 0 |
| 0.8493055555555555 | 0 |
| 0.85 | 0 |
| 0.8506944444444445 | 0 |
| 0.8513888888888889 | 0 |
| 0.8520833333333333 | 0 |
| 0.8527777777777777 | 0 |
| 0.8534722222222223 | 0 |
| 0.8541666666666666 | 0 |
| 0.8548611111111111 | 0 |
| 0.8555555555555556 | 0 |
| 0.8562500000000001 | 0 |
| 0.8569444444444444 | 0 |
| 0.8576388888888888 | 0 |
| 0.8583333333333334 | 0 |
| 0.8590277777777778 | 0 |
| 0.8597222222222222 | 0 |
| 0.8604166666666666 | 0 |
| 0.8611111111111112 | 0 |
| 0.8618055555555556 | 0 |
| 0.8624999999999999 | 0 |
| 0.8631944444444444 | 0 |
| 0.8638888888888889 | 0 |
| 0.8645833333333334 | 0 |
| 0.8652777777777777 | 0 |
| 0.8659722222222223 | 0 |
| 0.8666666666666667 | 0 |
| 0.8673611111111111 | 0 |
| 0.8680555555555555 | 0 |
| 0.86875 | 0 |
| 0.8694444444444445 | 0 |
| 0.8701388888888889 | 0 |
| 0.8708333333333332 | 0 |
| 0.8715277777777778 | 0 |
| 0.8722222222222222 | 0 |
| 0.8729166666666667 | 0 |
| 0.873611111111111 | 0 |
| 0.8743055555555556 | 0 |
| 0.875 | 0 |
| 0.8756944444444444 | 0 |
| 0.876388888888889 | 0 |
| 0.8770833333333333 | 0 |
| 0.8777777777777778 | 0 |
| 0.8784722222222222 | 0 |
| 0.8791666666666668 | 0 |
| 0.8798611111111111 | 0 |
| 0.8805555555555555 | 0 |
| 0.88125 | 0 |
| 0.8819444444444445 | 0 |
| 0.8826388888888889 | 0 |
| 0.8833333333333333 | 0 |
| 0.8840277777777777 | 0 |
| 0.8847222222222223 | 0 |
| 0.8854166666666666 | 0 |
| 0.8861111111111111 | 0 |
| 0.8868055555555556 | 0 |
| 0.8875000000000001 | 0 |
| 0.8881944444444444 | 0 |
| 0.8888888888888888 | 0 |
| 0.8895833333333334 | 0 |
| 0.8902777777777778 | 0 |
| 0.8909722222222222 | 0 |
| 0.8916666666666666 | 0 |
| 0.8923611111111112 | 0 |
| 0.8930555555555556 | 0 |
| 0.8937499999999999 | 0 |
| 0.8944444444444444 | 0 |
| 0.8951388888888889 | 0 |
| 0.8958333333333334 | 0 |
| 0.8965277777777777 | 0 |
| 0.8972222222222223 | 0 |
| 0.8979166666666667 | 0 |
| 0.8986111111111111 | 0 |
| 0.8993055555555555 | 0 |
| 0.9 | 0 |
| 0.9006944444444445 | 0 |
| 0.9013888888888889 | 0 |
| 0.9020833333333332 | 0 |
| 0.9027777777777778 | 0 |
| 0.9034722222222222 | 0 |
| 0.9041666666666667 | 0 |
| 0.904861111111111 | 0 |
| 0.9055555555555556 | 0 |
| 0.90625 | 0 |
| 0.9069444444444444 | 0 |
| 0.907638888888889 | 0 |
| 0.9083333333333333 | 0 |
| 0.9090277777777778 | 0 |
| 0.9097222222222222 | 0 |
| 0.9104166666666668 | 0 |
| 0.9111111111111111 | 0 |
| 0.9118055555555555 | 0 |
| 0.9125 | 0 |
| 0.9131944444444445 | 0 |
| 0.9138888888888889 | 0 |
| 0.9145833333333333 | 0 |
| 0.9152777777777777 | 0 |
| 0.9159722222222223 | 0 |
| 0.9166666666666666 | 0 |
| 0.9173611111111111 | 0 |
| 0.9180555555555556 | 0 |
| 0.9187500000000001 | 0 |
| 0.9194444444444444 | 0 |
| 0.9201388888888888 | 0 |
| 0.9208333333333334 | 0 |
| 0.9215277777777778 | 0 |
| 0.9222222222222222 | 0 |
| 0.9229166666666666 | 0 |
| 0.9236111111111112 | 0 |
| 0.9243055555555556 | 0 |
| 0.9249999999999999 | 0 |
| 0.9256944444444444 | 0 |
| 0.9263888888888889 | 0 |
| 0.9270833333333334 | 0 |
| 0.9277777777777777 | 0 |
| 0.9284722222222223 | 0 |
| 0.9291666666666667 | 0 |
| 0.9298611111111111 | 0 |
| 0.9305555555555555 | 0 |
| 0.93125 | 0 |
| 0.9319444444444445 | 0 |
| 0.9326388888888889 | 0 |
| 0.9333333333333332 | 0 |
| 0.9340277777777778 | 0 |
| 0.9347222222222222 | 0 |
| 0.9354166666666667 | 0 |
| 0.936111111111111 | 0 |
| 0.9368055555555556 | 0 |
| 0.9375 | 0 |
| 0.9381944444444444 | 0 |
| 0.938888888888889 | 0 |
| 0.9395833333333333 | 0 |
| 0.9402777777777778 | 0 |
| 0.9409722222222222 | 0 |
| 0.9416666666666668 | 0 |
| 0.9423611111111111 | 0 |
| 0.9430555555555555 | 0 |
| 0.94375 | 0 |
| 0.9444444444444445 | 0 |
| 0.9451388888888889 | 0 |
| 0.9458333333333333 | 0 |
| 0.9465277777777777 | 0 |
| 0.9472222222222223 | 0 |
| 0.9479166666666666 | 0 |
| 0.9486111111111111 | 0 |
| 0.9493055555555556 | 0 |
| 0.9500000000000001 | 0 |
| 0.9506944444444444 | 0 |
| 0.9513888888888888 | 0 |
| 0.9520833333333334 | 0 |
| 0.9527777777777778 | 0 |
| 0.9534722222222222 | 0 |
| 0.9541666666666666 | 0 |
| 0.9548611111111112 | 0 |
| 0.9555555555555556 | 0 |
| 0.9562499999999999 | 0 |
| 0.9569444444444444 | 0 |
| 0.9576388888888889 | 0 |
| 0.9583333333333334 | 0 |
| 0.9590277777777777 | 0 |
| 0.9597222222222223 | 0 |
| 0.9604166666666667 | 0 |
| 0.9611111111111111 | 0 |
| 0.9618055555555555 | 0 |
| 0.9625 | 0 |
| 0.9631944444444445 | 0 |
| 0.9638888888888889 | 0 |
| 0.9645833333333332 | 0 |
| 0.9652777777777778 | 0 |
| 0.9659722222222222 | 0 |
| 0.9666666666666667 | 0 |
| 0.967361111111111 | 0 |
| 0.9680555555555556 | 0 |
| 0.96875 | 0 |
| 0.9694444444444444 | 0 |
| 0.970138888888889 | 0 |
| 0.9708333333333333 | 0 |
| 0.9715277777777778 | 0 |
| 0.9722222222222222 | 0 |
| 0.9729166666666668 | 0 |
| 0.9736111111111111 | 0 |
| 0.9743055555555555 | 0 |
| 0.975 | 0 |
| 0.9756944444444445 | 0 |
| 0.9763888888888889 | 0 |
| 0.9770833333333333 | 0 |
| 0.9777777777777777 | 0 |
| 0.9784722222222223 | 0 |
| 0.9791666666666666 | 0 |
| 0.9798611111111111 | 0 |
| 0.9805555555555556 | 0 |
| 0.9812500000000001 | 0 |
| 0.9819444444444444 | 0 |
| 0.9826388888888888 | 0 |
| 0.9833333333333334 | 0 |
| 0.9840277777777778 | 0 |
| 0.9847222222222222 | 0 |
| 0.9854166666666666 | 0 |
| 0.9861111111111112 | 0 |
| 0.9868055555555556 | 0 |
| 0.9874999999999999 | 0 |
| 0.9881944444444444 | 0 |
| 0.9888888888888889 | 0 |
| 0.9895833333333334 | 0 |
| 0.9902777777777777 | 0 |
| 0.9909722222222223 | 0 |
| 0.9916666666666667 | 0 |
| 0.9923611111111111 | 0 |
| 0.9930555555555555 | 0 |
| 0.99375 | 0 |
| 0.9944444444444445 | 0 |
| 0.9951388888888889 | 0 |
| 0.9958333333333332 | 0 |
| 0.9965277777777778 | 0 |
| 0.9972222222222222 | 0 |
| 0.9979166666666667 | 0 |
| 0.998611111111111 | 0 |
| 0.9993055555555556 | 0 |